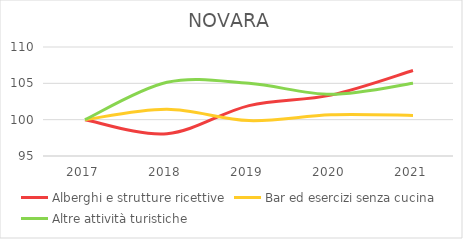
| Category | Alberghi e strutture ricettive | Bar ed esercizi senza cucina | Altre attività turistiche |
|---|---|---|---|
| 2017.0 | 100 | 100 | 100 |
| 2018.0 | 98.068 | 101.434 | 105.152 |
| 2019.0 | 101.932 | 99.873 | 105 |
| 2020.0 | 103.382 | 100.675 | 103.485 |
| 2021.0 | 106.763 | 100.59 | 105 |